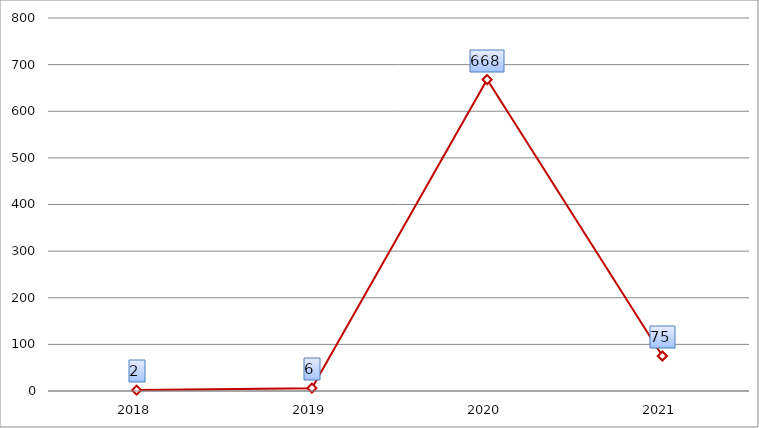
| Category | Total de produções |
|---|---|
| 2018 | 2 |
| 2019 | 6 |
| 2020 | 668 |
| 2021 | 75 |